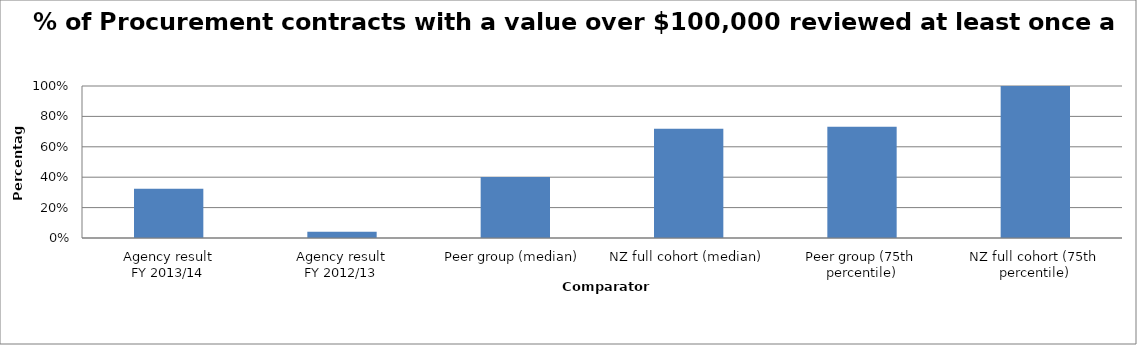
| Category | Series 0 |
|---|---|
| Agency result
FY 2013/14 | 0.324 |
| Agency result
FY 2012/13 | 0.041 |
| Peer group (median) | 0.402 |
| NZ full cohort (median) | 0.719 |
| Peer group (75th percentile) | 0.732 |
| NZ full cohort (75th percentile) | 1 |